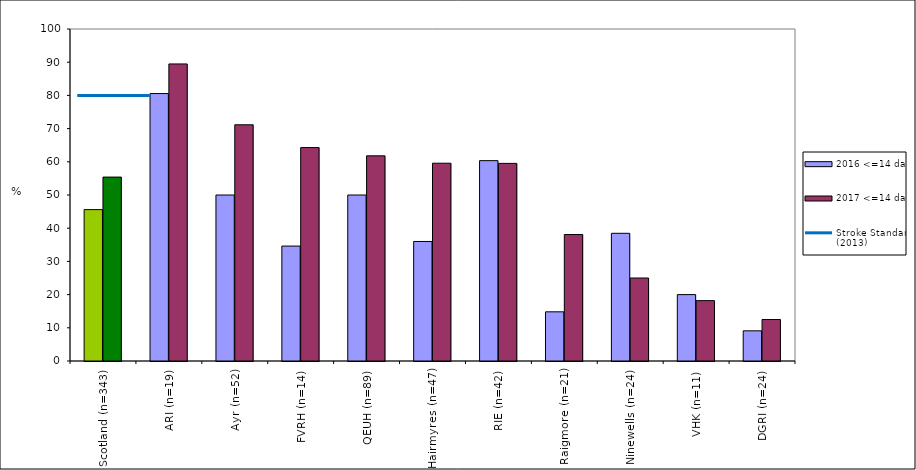
| Category | 2016 <=14 days | 2017 <=14 days |
|---|---|---|
| Scotland (n=343) | 45.596 | 55.394 |
| ARI (n=19) | 80.556 | 89.474 |
| Ayr (n=52) | 50 | 71.154 |
| FVRH (n=14) | 34.615 | 64.286 |
| QEUH (n=89) | 50 | 61.798 |
| Hairmyres (n=47) | 36 | 59.574 |
| RIE (n=42) | 60.345 | 59.524 |
| Raigmore (n=21) | 14.815 | 38.095 |
| Ninewells (n=24) | 38.462 | 25 |
| VHK (n=11) | 20 | 18.182 |
| DGRI (n=24) | 9.091 | 12.5 |